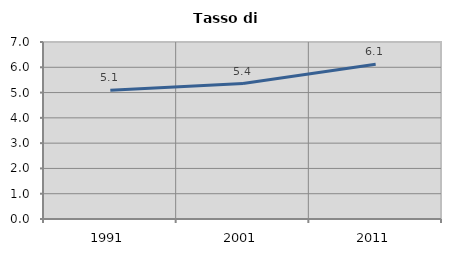
| Category | Tasso di disoccupazione   |
|---|---|
| 1991.0 | 5.093 |
| 2001.0 | 5.357 |
| 2011.0 | 6.119 |